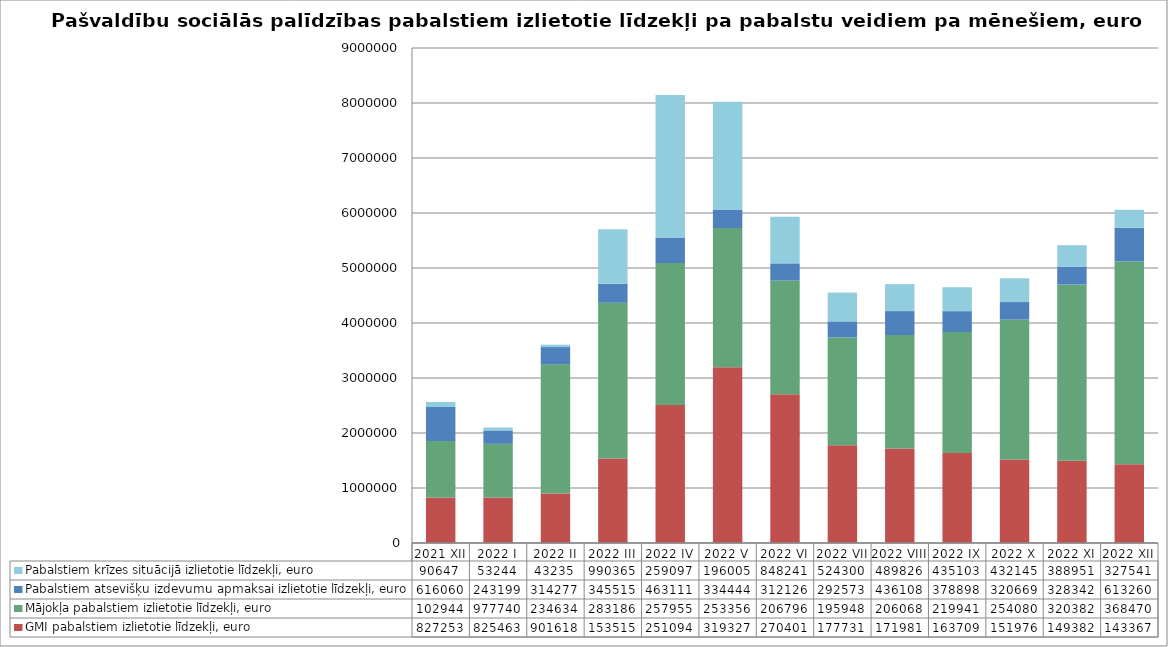
| Category | GMI pabalstiem izlietotie līdzekļi, euro | Mājokļa pabalstiem izlietotie līdzekļi, euro | Pabalstiem atsevišķu izdevumu apmaksai izlietotie līdzekļi, euro | Pabalstiem krīzes situācijā izlietotie līdzekļi, euro |
|---|---|---|---|---|
| 2021 XII | 827253 | 1029446 | 616060 | 90647 |
| 2022 I | 825463 | 977740 | 243199 | 53244 |
| 2022 II | 901618 | 2346342 | 314277 | 43235 |
| 2022 III | 1535158 | 2831867 | 345515 | 990365 |
| 2022 IV | 2510948 | 2579552 | 463111 | 2590974 |
| 2022 V | 3193273 | 2533564 | 334444 | 1960051 |
| 2022 VI | 2704016 | 2067966 | 312126 | 848241 |
| 2022 VII | 1777318 | 1959481 | 292573 | 524300 |
| 2022 VIII | 1719814 | 2060684 | 436108 | 489826 |
| 2022 IX | 1637094 | 2199417 | 378898 | 435103 |
| 2022 X | 1519767 | 2540805 | 320669 | 432145 |
| 2022 XI | 1493823 | 3203820 | 328342 | 388951 |
| 2022 XII | 1433674 | 3684701 | 613260 | 327541 |